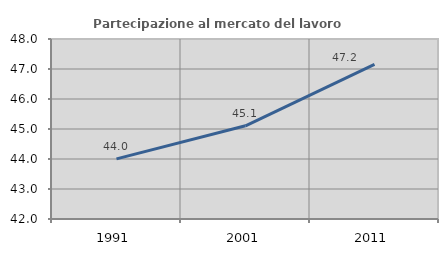
| Category | Partecipazione al mercato del lavoro  femminile |
|---|---|
| 1991.0 | 44.005 |
| 2001.0 | 45.107 |
| 2011.0 | 47.155 |